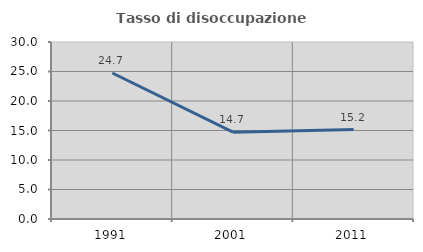
| Category | Tasso di disoccupazione giovanile  |
|---|---|
| 1991.0 | 24.749 |
| 2001.0 | 14.724 |
| 2011.0 | 15.152 |